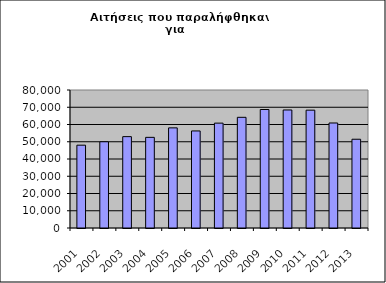
| Category | Series 1 |
|---|---|
| 2001.0 | 48010 |
| 2002.0 | 49998 |
| 2003.0 | 52964 |
| 2004.0 | 52551 |
| 2005.0 | 58046 |
| 2006.0 | 56263 |
| 2007.0 | 60792 |
| 2008.0 | 64163 |
| 2009.0 | 68694 |
| 2010.0 | 68418 |
| 2011.0 | 68310 |
| 2012.0 | 60877 |
| 2013.0 | 51451 |